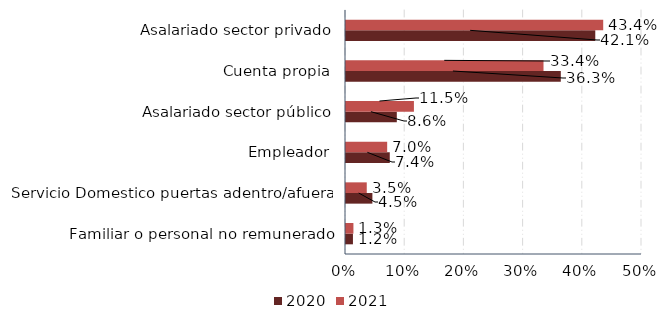
| Category | 2020 | 2021 |
|---|---|---|
| Familiar o personal no remunerado | 0.012 | 0.013 |
| Servicio Domestico puertas adentro/afuera | 0.045 | 0.035 |
| Empleador | 0.074 | 0.07 |
| Asalariado sector público | 0.086 | 0.115 |
| Cuenta propia | 0.363 | 0.334 |
| Asalariado sector privado | 0.421 | 0.434 |